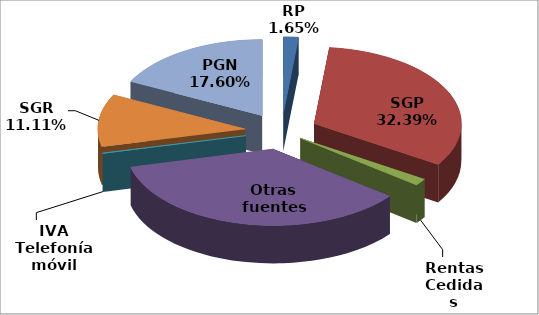
| Category | Series 0 |
|---|---|
| RP | 70559 |
| SGP | 1388454.384 |
| Rentas Cedidas | 64041 |
| Otras fuentes | 1527653.88 |
| IVA Telefonía móvil | 5622 |
| SGR | 476115.3 |
| PGN | 754269.3 |